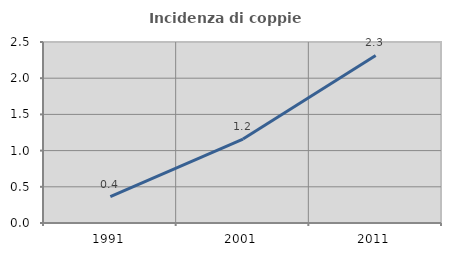
| Category | Incidenza di coppie miste |
|---|---|
| 1991.0 | 0.365 |
| 2001.0 | 1.159 |
| 2011.0 | 2.314 |